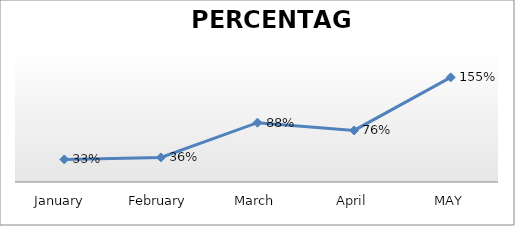
| Category | PERCENTAGE |
|---|---|
| January  | 0.334 |
| February | 0.364 |
| March | 0.878 |
| April | 0.764 |
| MAY | 1.55 |